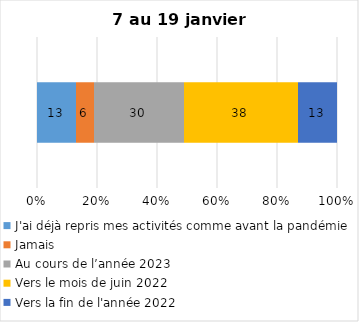
| Category | J'ai déjà repris mes activités comme avant la pandémie | Jamais | Au cours de l’année 2023 | Vers le mois de juin 2022 | Vers la fin de l'année 2022 |
|---|---|---|---|---|---|
| 0 | 13 | 6 | 30 | 38 | 13 |